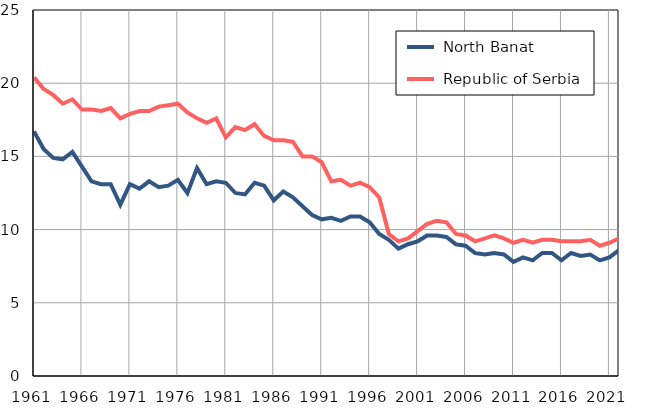
| Category |  North Banat |  Republic of Serbia |
|---|---|---|
| 1961.0 | 16.7 | 20.4 |
| 1962.0 | 15.5 | 19.6 |
| 1963.0 | 14.9 | 19.2 |
| 1964.0 | 14.8 | 18.6 |
| 1965.0 | 15.3 | 18.9 |
| 1966.0 | 14.3 | 18.2 |
| 1967.0 | 13.3 | 18.2 |
| 1968.0 | 13.1 | 18.1 |
| 1969.0 | 13.1 | 18.3 |
| 1970.0 | 11.7 | 17.6 |
| 1971.0 | 13.1 | 17.9 |
| 1972.0 | 12.8 | 18.1 |
| 1973.0 | 13.3 | 18.1 |
| 1974.0 | 12.9 | 18.4 |
| 1975.0 | 13 | 18.5 |
| 1976.0 | 13.4 | 18.6 |
| 1977.0 | 12.5 | 18 |
| 1978.0 | 14.2 | 17.6 |
| 1979.0 | 13.1 | 17.3 |
| 1980.0 | 13.3 | 17.6 |
| 1981.0 | 13.2 | 16.3 |
| 1982.0 | 12.5 | 17 |
| 1983.0 | 12.4 | 16.8 |
| 1984.0 | 13.2 | 17.2 |
| 1985.0 | 13 | 16.4 |
| 1986.0 | 12 | 16.1 |
| 1987.0 | 12.6 | 16.1 |
| 1988.0 | 12.2 | 16 |
| 1989.0 | 11.6 | 15 |
| 1990.0 | 11 | 15 |
| 1991.0 | 10.7 | 14.6 |
| 1992.0 | 10.8 | 13.3 |
| 1993.0 | 10.6 | 13.4 |
| 1994.0 | 10.9 | 13 |
| 1995.0 | 10.9 | 13.2 |
| 1996.0 | 10.5 | 12.9 |
| 1997.0 | 9.7 | 12.2 |
| 1998.0 | 9.3 | 9.7 |
| 1999.0 | 8.7 | 9.2 |
| 2000.0 | 9 | 9.4 |
| 2001.0 | 9.2 | 9.9 |
| 2002.0 | 9.6 | 10.4 |
| 2003.0 | 9.6 | 10.6 |
| 2004.0 | 9.5 | 10.5 |
| 2005.0 | 9 | 9.7 |
| 2006.0 | 8.9 | 9.6 |
| 2007.0 | 8.4 | 9.2 |
| 2008.0 | 8.3 | 9.4 |
| 2009.0 | 8.4 | 9.6 |
| 2010.0 | 8.3 | 9.4 |
| 2011.0 | 7.8 | 9.1 |
| 2012.0 | 8.1 | 9.3 |
| 2013.0 | 7.9 | 9.1 |
| 2014.0 | 8.4 | 9.3 |
| 2015.0 | 8.4 | 9.3 |
| 2016.0 | 7.9 | 9.2 |
| 2017.0 | 8.4 | 9.2 |
| 2018.0 | 8.2 | 9.2 |
| 2019.0 | 8.3 | 9.3 |
| 2020.0 | 7.9 | 8.9 |
| 2021.0 | 8.1 | 9.1 |
| 2022.0 | 8.6 | 9.4 |